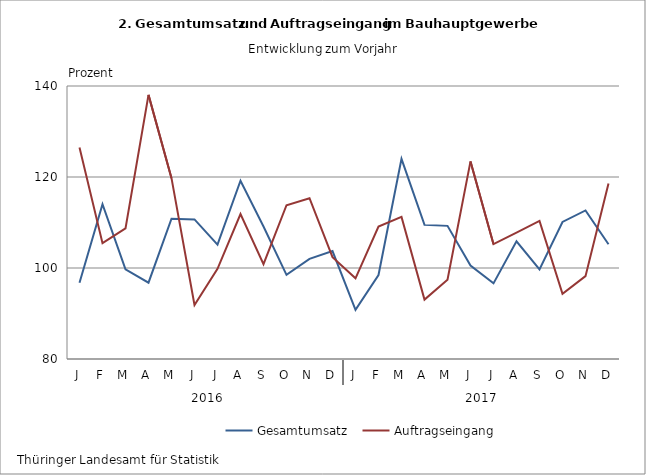
| Category | Gesamtumsatz | Auftragseingang |
|---|---|---|
| J | 96.763 | 126.506 |
| F | 114.013 | 105.448 |
| M | 99.719 | 108.704 |
| A | 96.771 | 138.05 |
| M | 110.832 | 119.749 |
| J | 110.673 | 91.862 |
| J | 105.14 | 99.81 |
| A | 119.182 | 111.868 |
| S | 109.109 | 100.837 |
| O | 98.501 | 113.797 |
| N | 102.014 | 115.341 |
| D | 103.723 | 102.385 |
| J | 90.789 | 97.73 |
| F | 98.458 | 109.118 |
| M | 123.986 | 111.24 |
| A | 109.475 | 93.051 |
| M | 109.259 | 97.42 |
| J | 100.553 | 123.429 |
| J | 96.625 | 105.242 |
| A | 105.857 | 107.768 |
| S | 99.68 | 110.336 |
| O | 110.118 | 94.306 |
| N | 112.645 | 98.21 |
| D | 105.228 | 118.563 |